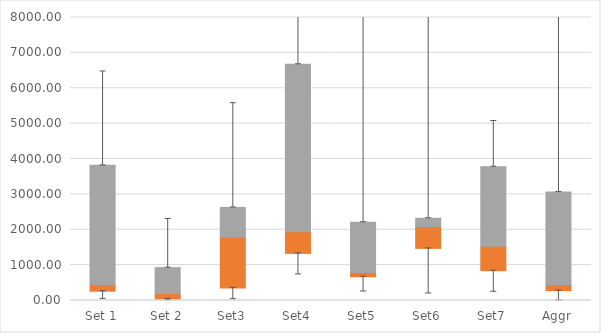
| Category | Q1 | Median-Q1 | Q3-Median |
|---|---|---|---|
| Set 1 | 262.42 | 191.104 | 3366.661 |
| Set 2 | 42.812 | 155.188 | 730.897 |
| Set3 | 356.171 | 1433.594 | 841.4 |
| Set4 | 1330.852 | 609.634 | 4737.886 |
| Set5 | 671.24 | 119.188 | 1422.754 |
| Set6 | 1472.878 | 617.753 | 234.692 |
| Set7 | 842.585 | 691.817 | 2247.18 |
| Aggr | 280.866 | 172.657 | 2613.06 |